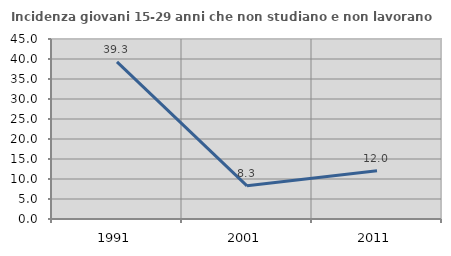
| Category | Incidenza giovani 15-29 anni che non studiano e non lavorano  |
|---|---|
| 1991.0 | 39.27 |
| 2001.0 | 8.296 |
| 2011.0 | 12.046 |